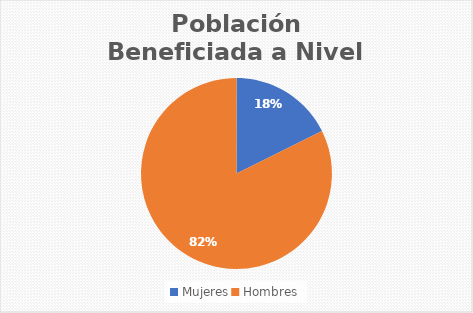
| Category | Series 0 |
|---|---|
| Mujeres | 3 |
| Hombres | 14 |